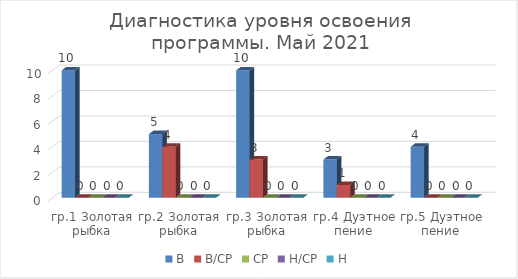
| Category | В | В/СР | СР | Н/СР | Н |
|---|---|---|---|---|---|
| гр.1 Золотая рыбка | 10 | 0 | 0 | 0 | 0 |
| гр.2 Золотая рыбка | 5 | 4 | 0 | 0 | 0 |
| гр.3 Золотая рыбка | 10 | 3 | 0 | 0 | 0 |
| гр.4 Дуэтное пение | 3 | 1 | 0 | 0 | 0 |
| гр.5 Дуэтное пение | 4 | 0 | 0 | 0 | 0 |